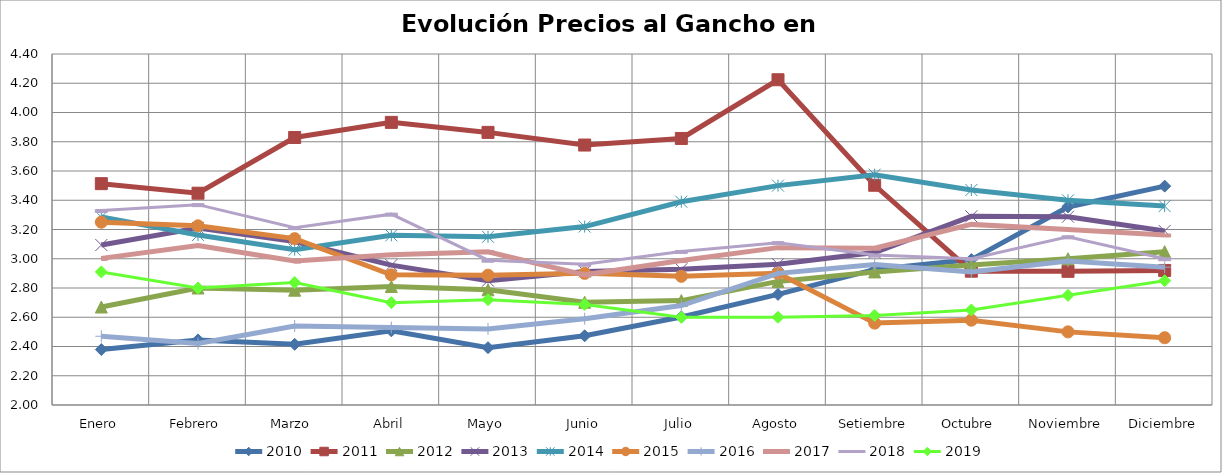
| Category | 2010 | 2011 | 2012 | 2013 | 2014 | 2015 | 2016 | 2017 | 2018 | 2019 |
|---|---|---|---|---|---|---|---|---|---|---|
| Enero | 2.379 | 3.513 | 2.67 | 3.094 | 3.285 | 3.25 | 2.47 | 3.002 | 3.33 | 2.91 |
| Febrero | 2.445 | 3.448 | 2.8 | 3.211 | 3.162 | 3.225 | 2.42 | 3.09 | 3.37 | 2.8 |
| Marzo  | 2.415 | 3.829 | 2.785 | 3.118 | 3.062 | 3.137 | 2.54 | 2.984 | 3.213 | 2.838 |
| Abril | 2.507 | 3.932 | 2.81 | 2.957 | 3.16 | 2.89 | 2.53 | 3.028 | 3.305 | 2.7 |
| Mayo | 2.392 | 3.864 | 2.788 | 2.85 | 3.15 | 2.888 | 2.52 | 3.048 | 2.99 | 2.72 |
| Junio | 2.473 | 3.778 | 2.702 | 2.912 | 3.22 | 2.9 | 2.59 | 2.89 | 2.963 | 2.688 |
| Julio | 2.602 | 3.822 | 2.714 | 2.928 | 3.39 | 2.88 | 2.68 | 2.988 | 3.05 | 2.6 |
| Agosto | 2.756 | 4.224 | 2.845 | 2.963 | 3.5 | 2.9 | 2.9 | 3.076 | 3.11 | 2.6 |
| Setiembre | 2.927 | 3.502 | 2.91 | 3.042 | 3.575 | 2.56 | 2.96 | 3.073 | 3.025 | 2.612 |
| Octubre | 2.994 | 2.915 | 2.957 | 3.29 | 3.47 | 2.58 | 2.91 | 3.235 | 3 | 2.65 |
| Noviembre | 3.354 | 2.914 | 3 | 3.288 | 3.4 | 2.5 | 2.984 | 3.2 | 3.15 | 2.75 |
| Diciembre | 3.496 | 2.92 | 3.049 | 3.19 | 3.36 | 2.46 | 2.942 | 3.162 | 3 | 2.85 |